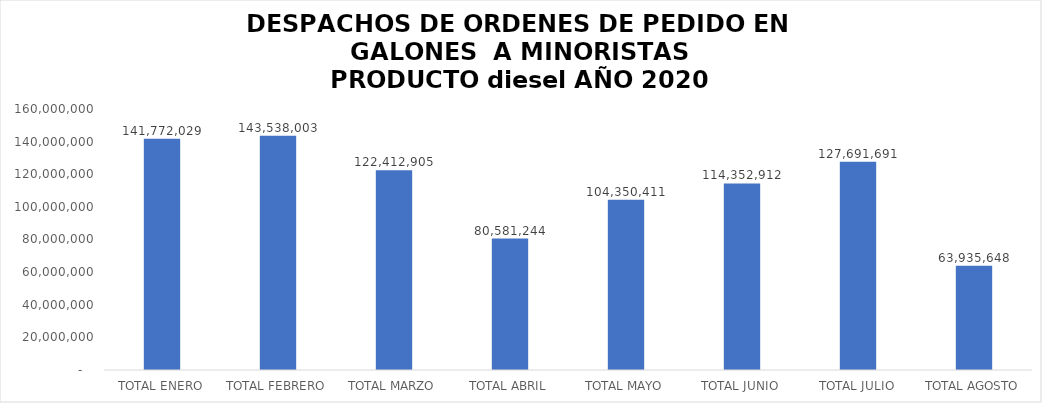
| Category | Series 0 |
|---|---|
| TOTAL ENERO | 141772028.5 |
| TOTAL FEBRERO | 143538002.58 |
| TOTAL MARZO | 122412904.68 |
| TOTAL ABRIL | 80581243.97 |
| TOTAL MAYO | 104350411 |
| TOTAL JUNIO | 114352912 |
| TOTAL JULIO | 127691691 |
| TOTAL AGOSTO | 63935647.99 |